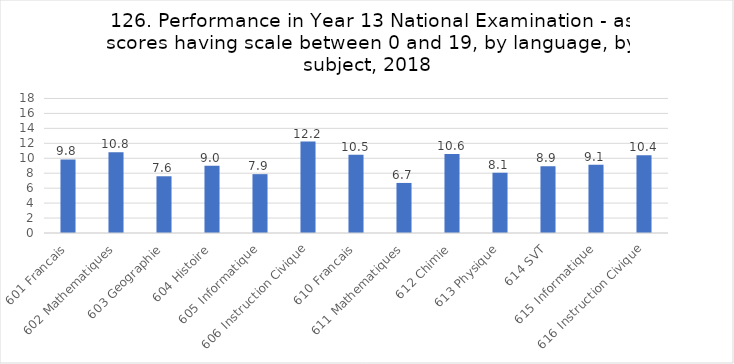
| Category | Series 0 |
|---|---|
| 601 Francais | 9.837 |
| 602 Mathematiques | 10.801 |
| 603 Geographie | 7.59 |
| 604 Histoire | 8.988 |
| 605 Informatique | 7.873 |
| 606 Instruction Civique | 12.229 |
| 610 Francais | 10.459 |
| 611 Mathematiques | 6.698 |
| 612 Chimie | 10.56 |
| 613 Physique | 8.063 |
| 614 SVT | 8.925 |
| 615 Informatique | 9.138 |
| 616 Instruction Civique | 10.39 |